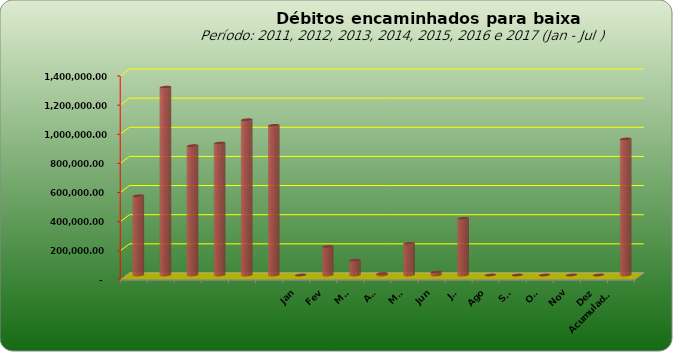
| Category |  543.796,20  |
|---|---|
|  | 543796.2 |
|  | 1289053.69 |
|  | 887573.08 |
|  | 905052.31 |
|  | 1065434.28 |
|  | 1027209.41 |
| Jan | 0 |
| Fev | 195564.55 |
| Mar | 101757.11 |
| Abr | 10195.55 |
| Mai | 217067.29 |
| Jun | 19848.93 |
| Jul | 389298.76 |
| Ago | 0 |
| Set | 0 |
| Out | 0 |
| Nov | 0 |
| Dez | 0 |
| Acumulado
2016 | 933732.19 |